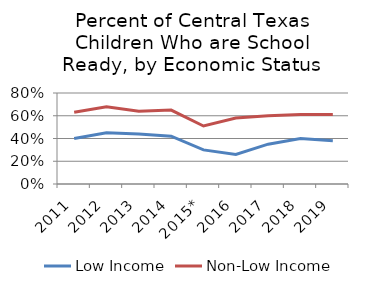
| Category | Low Income | Non-Low Income |
|---|---|---|
| 2011 | 0.4 | 0.63 |
| 2012 | 0.45 | 0.68 |
| 2013 | 0.44 | 0.64 |
| 2014 | 0.42 | 0.65 |
| 2015* | 0.3 | 0.51 |
| 2016 | 0.26 | 0.58 |
| 2017 | 0.35 | 0.6 |
| 2018 | 0.4 | 0.61 |
| 2019 | 0.38 | 0.61 |